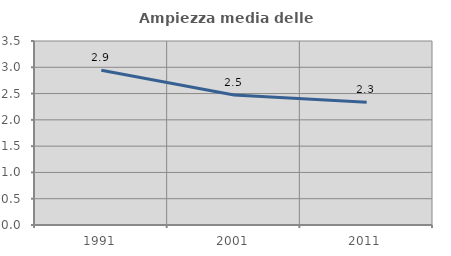
| Category | Ampiezza media delle famiglie |
|---|---|
| 1991.0 | 2.945 |
| 2001.0 | 2.472 |
| 2011.0 | 2.336 |